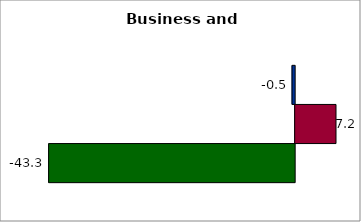
| Category | 50 states and D.C. | SREB states | State |
|---|---|---|---|
| 0 | -0.461 | 7.186 | -43.29 |